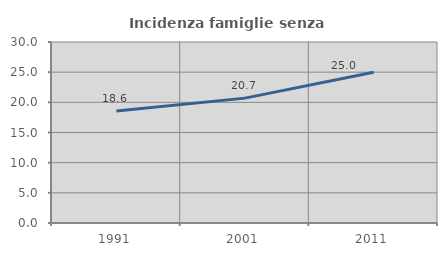
| Category | Incidenza famiglie senza nuclei |
|---|---|
| 1991.0 | 18.575 |
| 2001.0 | 20.697 |
| 2011.0 | 25 |